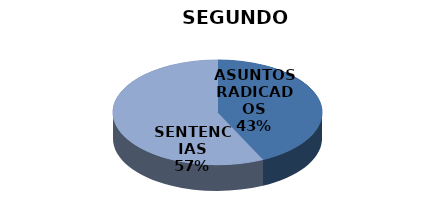
| Category | Series 0 |
|---|---|
| ASUNTOS RADICADOS | 3 |
| SENTENCIAS | 4 |